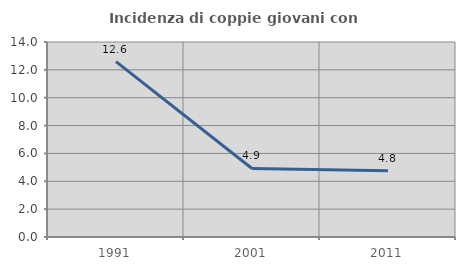
| Category | Incidenza di coppie giovani con figli |
|---|---|
| 1991.0 | 12.587 |
| 2001.0 | 4.918 |
| 2011.0 | 4.762 |